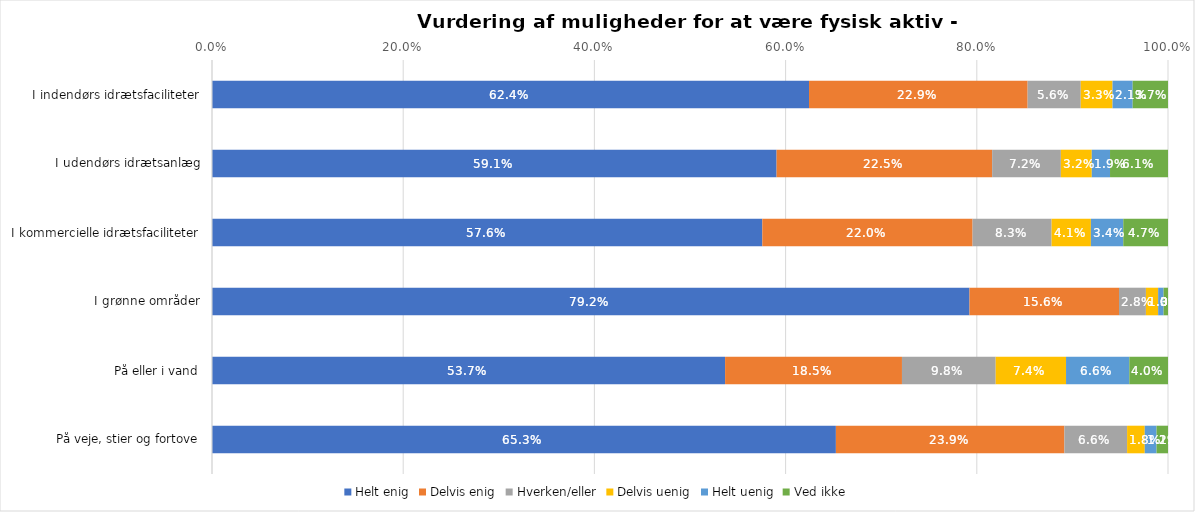
| Category | Helt enig | Delvis enig | Hverken/eller | Delvis uenig | Helt uenig | Ved ikke |
|---|---|---|---|---|---|---|
| I indendørs idrætsfaciliteter | 0.624 | 0.229 | 0.056 | 0.033 | 0.021 | 0.037 |
| I udendørs idrætsanlæg | 0.591 | 0.225 | 0.072 | 0.032 | 0.019 | 0.061 |
| I kommercielle idrætsfaciliteter | 0.576 | 0.22 | 0.083 | 0.041 | 0.034 | 0.047 |
| I grønne områder | 0.792 | 0.156 | 0.028 | 0.013 | 0.006 | 0.005 |
| På eller i vand | 0.537 | 0.185 | 0.098 | 0.074 | 0.066 | 0.04 |
| På veje, stier og fortove | 0.653 | 0.239 | 0.066 | 0.018 | 0.012 | 0.012 |